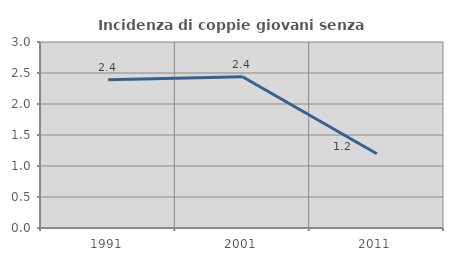
| Category | Incidenza di coppie giovani senza figli |
|---|---|
| 1991.0 | 2.39 |
| 2001.0 | 2.439 |
| 2011.0 | 1.198 |